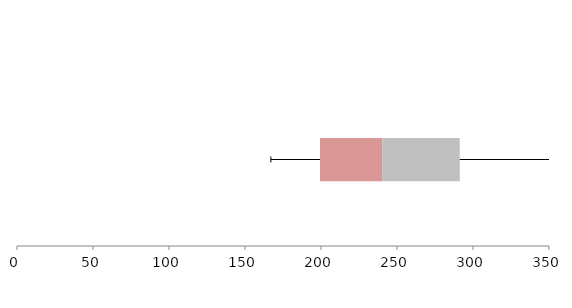
| Category | Series 1 | Series 2 | Series 3 |
|---|---|---|---|
| 0 | 199.323 | 40.966 | 51.001 |